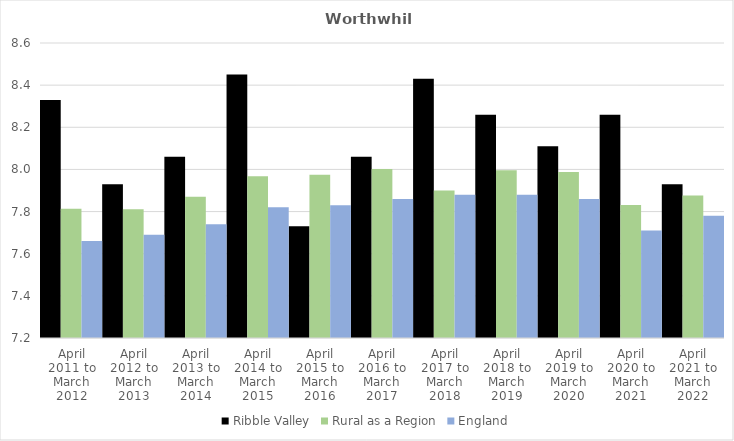
| Category | Ribble Valley | Rural as a Region | England |
|---|---|---|---|
| April 2011 to March 2012 | 8.33 | 7.813 | 7.66 |
| April 2012 to March 2013 | 7.93 | 7.811 | 7.69 |
| April 2013 to March 2014 | 8.06 | 7.871 | 7.74 |
| April 2014 to March 2015 | 8.45 | 7.967 | 7.82 |
| April 2015 to March 2016 | 7.73 | 7.975 | 7.83 |
| April 2016 to March 2017 | 8.06 | 8.002 | 7.86 |
| April 2017 to March 2018 | 8.43 | 7.9 | 7.88 |
| April 2018 to March 2019 | 8.26 | 7.996 | 7.88 |
| April 2019 to March 2020 | 8.11 | 7.988 | 7.86 |
| April 2020 to March 2021 | 8.26 | 7.831 | 7.71 |
| April 2021 to March 2022 | 7.93 | 7.877 | 7.78 |